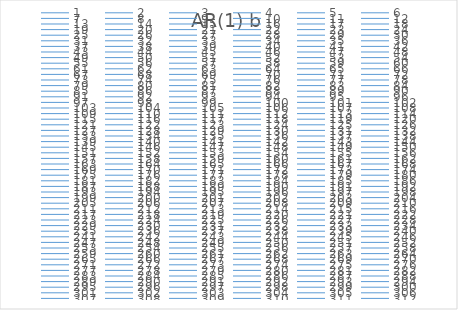
| Category | AR(1) b |
|---|---|
| 0 | 0 |
| 1 | 10.813 |
| 2 | 10.094 |
| 3 | 10.044 |
| 4 | 9.449 |
| 5 | 9.717 |
| 6 | 10.695 |
| 7 | 11.445 |
| 8 | 9.728 |
| 9 | 10.068 |
| 10 | 10.261 |
| 11 | 9.492 |
| 12 | 8.882 |
| 13 | 8.172 |
| 14 | 9.395 |
| 15 | 9.969 |
| 16 | 10.736 |
| 17 | 11.053 |
| 18 | 11.85 |
| 19 | 10.856 |
| 20 | 11.223 |
| 21 | 10.993 |
| 22 | 11.755 |
| 23 | 11.347 |
| 24 | 11.722 |
| 25 | 10.661 |
| 26 | 11.094 |
| 27 | 9.016 |
| 28 | 8.883 |
| 29 | 8.499 |
| 30 | 9.548 |
| 31 | 10.258 |
| 32 | 6.981 |
| 33 | 7.158 |
| 34 | 7.87 |
| 35 | 8.87 |
| 36 | 11.303 |
| 37 | 11.255 |
| 38 | 10.125 |
| 39 | 10.682 |
| 40 | 10.586 |
| 41 | 10.559 |
| 42 | 12.574 |
| 43 | 11.2 |
| 44 | 10.46 |
| 45 | 10.274 |
| 46 | 10.155 |
| 47 | 10.942 |
| 48 | 9.02 |
| 49 | 9.699 |
| 50 | 11.443 |
| 51 | 11.402 |
| 52 | 12.624 |
| 53 | 9.257 |
| 54 | 10.31 |
| 55 | 8.847 |
| 56 | 8.935 |
| 57 | 10.042 |
| 58 | 11.55 |
| 59 | 11.47 |
| 60 | 10.523 |
| 61 | 9.359 |
| 62 | 9.03 |
| 63 | 11.104 |
| 64 | 10.862 |
| 65 | 10.863 |
| 66 | 10.563 |
| 67 | 9.605 |
| 68 | 10.892 |
| 69 | 9.369 |
| 70 | 9.479 |
| 71 | 10.925 |
| 72 | 10.138 |
| 73 | 8.749 |
| 74 | 8.243 |
| 75 | 7.033 |
| 76 | 9.85 |
| 77 | 9.985 |
| 78 | 11.662 |
| 79 | 10.597 |
| 80 | 9.946 |
| 81 | 10.268 |
| 82 | 9.224 |
| 83 | 7.988 |
| 84 | 9.903 |
| 85 | 11.874 |
| 86 | 12.39 |
| 87 | 9.499 |
| 88 | 10.549 |
| 89 | 10.65 |
| 90 | 9.109 |
| 91 | 9.109 |
| 92 | 9.864 |
| 93 | 10.679 |
| 94 | 10.731 |
| 95 | 11.483 |
| 96 | 9.414 |
| 97 | 10.863 |
| 98 | 10.471 |
| 99 | 8.773 |
| 100 | 10.131 |
| 101 | 10.545 |
| 102 | 8.943 |
| 103 | 9.358 |
| 104 | 7.979 |
| 105 | 8.893 |
| 106 | 9.962 |
| 107 | 10.95 |
| 108 | 12.26 |
| 109 | 11.62 |
| 110 | 10.914 |
| 111 | 10.415 |
| 112 | 8.164 |
| 113 | 10.103 |
| 114 | 9.058 |
| 115 | 8.624 |
| 116 | 6.005 |
| 117 | 6.641 |
| 118 | 8.198 |
| 119 | 9.646 |
| 120 | 11.105 |
| 121 | 10.276 |
| 122 | 9.517 |
| 123 | 9.997 |
| 124 | 9.737 |
| 125 | 9.545 |
| 126 | 8.88 |
| 127 | 12.295 |
| 128 | 10.31 |
| 129 | 11.488 |
| 130 | 8.849 |
| 131 | 8.909 |
| 132 | 8.953 |
| 133 | 9.779 |
| 134 | 10.391 |
| 135 | 9.026 |
| 136 | 8.62 |
| 137 | 8.059 |
| 138 | 8.921 |
| 139 | 10.451 |
| 140 | 10.671 |
| 141 | 10.504 |
| 142 | 10.377 |
| 143 | 9.277 |
| 144 | 10.052 |
| 145 | 9.149 |
| 146 | 10.252 |
| 147 | 7.57 |
| 148 | 9.956 |
| 149 | 9.194 |
| 150 | 9.513 |
| 151 | 8.534 |
| 152 | 9.52 |
| 153 | 10.691 |
| 154 | 13.11 |
| 155 | 11.571 |
| 156 | 11.27 |
| 157 | 10.153 |
| 158 | 10.844 |
| 159 | 12.514 |
| 160 | 12.724 |
| 161 | 11.091 |
| 162 | 11.281 |
| 163 | 11.294 |
| 164 | 10.148 |
| 165 | 10.105 |
| 166 | 10.092 |
| 167 | 9.353 |
| 168 | 9.943 |
| 169 | 9.673 |
| 170 | 9.339 |
| 171 | 8.583 |
| 172 | 9.622 |
| 173 | 9.031 |
| 174 | 8.867 |
| 175 | 8.43 |
| 176 | 9.259 |
| 177 | 10.846 |
| 178 | 10.447 |
| 179 | 9.868 |
| 180 | 9.179 |
| 181 | 9.548 |
| 182 | 10.402 |
| 183 | 9.808 |
| 184 | 8.907 |
| 185 | 10.037 |
| 186 | 10.544 |
| 187 | 9.593 |
| 188 | 9.056 |
| 189 | 9.309 |
| 190 | 11.484 |
| 191 | 11.025 |
| 192 | 11.808 |
| 193 | 11.306 |
| 194 | 11.188 |
| 195 | 10.1 |
| 196 | 10.017 |
| 197 | 9.068 |
| 198 | 8.749 |
| 199 | 8.097 |
| 200 | 9.904 |
| 201 | 8.163 |
| 202 | 9.476 |
| 203 | 10.527 |
| 204 | 11.322 |
| 205 | 11.563 |
| 206 | 8.325 |
| 207 | 8.853 |
| 208 | 9.929 |
| 209 | 8.866 |
| 210 | 8.259 |
| 211 | 8.501 |
| 212 | 10.261 |
| 213 | 10.568 |
| 214 | 11.253 |
| 215 | 10.331 |
| 216 | 12.087 |
| 217 | 11.179 |
| 218 | 11.129 |
| 219 | 10.89 |
| 220 | 11.674 |
| 221 | 11.089 |
| 222 | 9.984 |
| 223 | 12.224 |
| 224 | 11.684 |
| 225 | 11.246 |
| 226 | 10.461 |
| 227 | 11.702 |
| 228 | 9.633 |
| 229 | 11.348 |
| 230 | 10.248 |
| 231 | 10.465 |
| 232 | 12.583 |
| 233 | 11.606 |
| 234 | 12.127 |
| 235 | 10.331 |
| 236 | 8.938 |
| 237 | 8.533 |
| 238 | 9.311 |
| 239 | 10.004 |
| 240 | 8.482 |
| 241 | 9.348 |
| 242 | 8.293 |
| 243 | 7.697 |
| 244 | 10.071 |
| 245 | 10.249 |
| 246 | 11.872 |
| 247 | 10.349 |
| 248 | 11.181 |
| 249 | 11.291 |
| 250 | 12.877 |
| 251 | 11.656 |
| 252 | 9.669 |
| 253 | 10.291 |
| 254 | 10.229 |
| 255 | 11.214 |
| 256 | 10.821 |
| 257 | 10.103 |
| 258 | 9.152 |
| 259 | 9.466 |
| 260 | 9.901 |
| 261 | 8.586 |
| 262 | 10.119 |
| 263 | 9.562 |
| 264 | 12.161 |
| 265 | 9.376 |
| 266 | 10.036 |
| 267 | 9.888 |
| 268 | 9.929 |
| 269 | 10.938 |
| 270 | 9.511 |
| 271 | 8.673 |
| 272 | 9.683 |
| 273 | 9.074 |
| 274 | 9.221 |
| 275 | 8.369 |
| 276 | 7.662 |
| 277 | 9.428 |
| 278 | 11.162 |
| 279 | 11.599 |
| 280 | 10.705 |
| 281 | 9.859 |
| 282 | 10.42 |
| 283 | 10.756 |
| 284 | 10.43 |
| 285 | 11.504 |
| 286 | 10.374 |
| 287 | 10.218 |
| 288 | 9.859 |
| 289 | 8.685 |
| 290 | 9.609 |
| 291 | 9.538 |
| 292 | 10.881 |
| 293 | 11.34 |
| 294 | 11.593 |
| 295 | 11.189 |
| 296 | 9.542 |
| 297 | 10.775 |
| 298 | 8.798 |
| 299 | 10.122 |
| 300 | 10.342 |
| 301 | 10.448 |
| 302 | 9.932 |
| 303 | 7.974 |
| 304 | 9.441 |
| 305 | 9.799 |
| 306 | 9.631 |
| 307 | 8.909 |
| 308 | 7.524 |
| 309 | 8.247 |
| 310 | 9.099 |
| 311 | 8.601 |
| 312 | 9.78 |
| 313 | 9.628 |
| 314 | 10.749 |
| 315 | 10.582 |
| 316 | 11.509 |
| 317 | 11.644 |
| 318 | 11.151 |
| 319 | 10.192 |
| 320 | 9.566 |
| 321 | 11.265 |
| 322 | 9.365 |
| 323 | 11.868 |
| 324 | 11.073 |
| 325 | 11.302 |
| 326 | 8.899 |
| 327 | 9.624 |
| 328 | 8.49 |
| 329 | 9.908 |
| 330 | 9.689 |
| 331 | 11.516 |
| 332 | 10.78 |
| 333 | 10.123 |
| 334 | 10.846 |
| 335 | 10.592 |
| 336 | 9.783 |
| 337 | 9.623 |
| 338 | 9.163 |
| 339 | 10.459 |
| 340 | 9.489 |
| 341 | 9.705 |
| 342 | 11.198 |
| 343 | 11.092 |
| 344 | 9.474 |
| 345 | 11.626 |
| 346 | 11.107 |
| 347 | 12.033 |
| 348 | 10.606 |
| 349 | 11.089 |
| 350 | 10.267 |
| 351 | 9.487 |
| 352 | 11.353 |
| 353 | 11.038 |
| 354 | 11.392 |
| 355 | 9.843 |
| 356 | 9.565 |
| 357 | 8.749 |
| 358 | 7.931 |
| 359 | 10.379 |
| 360 | 10.413 |
| 361 | 10.34 |
| 362 | 8.501 |
| 363 | 9.271 |
| 364 | 10.007 |
| 365 | 10.228 |
| 366 | 10.573 |
| 367 | 9.664 |
| 368 | 8.932 |
| 369 | 9.156 |
| 370 | 9.862 |
| 371 | 9.961 |
| 372 | 10.004 |
| 373 | 9.21 |
| 374 | 11.567 |
| 375 | 8.656 |
| 376 | 8.212 |
| 377 | 7.551 |
| 378 | 8.425 |
| 379 | 9.176 |
| 380 | 9.595 |
| 381 | 9.531 |
| 382 | 8.228 |
| 383 | 10.449 |
| 384 | 9.657 |
| 385 | 10.012 |
| 386 | 10.654 |
| 387 | 11.598 |
| 388 | 9.757 |
| 389 | 8.477 |
| 390 | 7.772 |
| 391 | 10.669 |
| 392 | 10.709 |
| 393 | 10.188 |
| 394 | 9.016 |
| 395 | 9.33 |
| 396 | 10.901 |
| 397 | 10.006 |
| 398 | 10.558 |
| 399 | 11.66 |
| 400 | 10 |
| 401 | 10.012 |
| 402 | 10.557 |
| 403 | 9.324 |
| 404 | 10.92 |
| 405 | 9.832 |
| 406 | 9.98 |
| 407 | 8.627 |
| 408 | 11.596 |
| 409 | 10.931 |
| 410 | 10.445 |
| 411 | 10.244 |
| 412 | 9.339 |
| 413 | 11.382 |
| 414 | 10.764 |
| 415 | 11.091 |
| 416 | 11.231 |
| 417 | 9.194 |
| 418 | 10.293 |
| 419 | 8.708 |
| 420 | 9.278 |
| 421 | 10.378 |
| 422 | 10.544 |
| 423 | 11.895 |
| 424 | 11.818 |
| 425 | 12.122 |
| 426 | 12.267 |
| 427 | 11.859 |
| 428 | 9.481 |
| 429 | 8.974 |
| 430 | 8.027 |
| 431 | 9.08 |
| 432 | 10.727 |
| 433 | 9.978 |
| 434 | 9.809 |
| 435 | 12.011 |
| 436 | 12.766 |
| 437 | 11.688 |
| 438 | 10.185 |
| 439 | 11.078 |
| 440 | 11.728 |
| 441 | 13.681 |
| 442 | 12.117 |
| 443 | 9.689 |
| 444 | 9.347 |
| 445 | 7.471 |
| 446 | 8.82 |
| 447 | 9.417 |
| 448 | 11.1 |
| 449 | 12.466 |
| 450 | 9.768 |
| 451 | 10.961 |
| 452 | 10.174 |
| 453 | 11.199 |
| 454 | 10.828 |
| 455 | 9.427 |
| 456 | 9.63 |
| 457 | 9.587 |
| 458 | 9.605 |
| 459 | 9.937 |
| 460 | 10.302 |
| 461 | 9.433 |
| 462 | 8.477 |
| 463 | 7.633 |
| 464 | 10.162 |
| 465 | 10.442 |
| 466 | 11.858 |
| 467 | 10.602 |
| 468 | 11.202 |
| 469 | 10.843 |
| 470 | 10.03 |
| 471 | 8.093 |
| 472 | 10.062 |
| 473 | 10.066 |
| 474 | 12.865 |
| 475 | 11.698 |
| 476 | 11.689 |
| 477 | 9.858 |
| 478 | 8.529 |
| 479 | 9.584 |
| 480 | 11.328 |
| 481 | 11.779 |
| 482 | 12.041 |
| 483 | 11.243 |
| 484 | 9.694 |
| 485 | 9.781 |
| 486 | 8.891 |
| 487 | 9.332 |
| 488 | 8.987 |
| 489 | 8.744 |
| 490 | 8.061 |
| 491 | 9.221 |
| 492 | 9.925 |
| 493 | 10.091 |
| 494 | 10.04 |
| 495 | 10.768 |
| 496 | 9.211 |
| 497 | 9.65 |
| 498 | 11.388 |
| 499 | 11.882 |
| 500 | 11.444 |
| 501 | 9.921 |
| 502 | 9.325 |
| 503 | 9.978 |
| 504 | 10.411 |
| 505 | 10.087 |
| 506 | 9.506 |
| 507 | 9.771 |
| 508 | 10.791 |
| 509 | 10.473 |
| 510 | 11.027 |
| 511 | 10.042 |
| 512 | 8.865 |
| 513 | 9.867 |
| 514 | 8.156 |
| 515 | 7.932 |
| 516 | 10.777 |
| 517 | 11.094 |
| 518 | 11.385 |
| 519 | 9.68 |
| 520 | 10.66 |
| 521 | 10.271 |
| 522 | 8.721 |
| 523 | 7.754 |
| 524 | 7.63 |
| 525 | 8.31 |
| 526 | 7.696 |
| 527 | 9.154 |
| 528 | 8.654 |
| 529 | 9.42 |
| 530 | 8.302 |
| 531 | 9.101 |
| 532 | 8.447 |
| 533 | 9.211 |
| 534 | 9.669 |
| 535 | 9.942 |
| 536 | 10.941 |
| 537 | 10.58 |
| 538 | 9.643 |
| 539 | 9.345 |
| 540 | 11.491 |
| 541 | 11.376 |
| 542 | 11.549 |
| 543 | 11.526 |
| 544 | 11.616 |
| 545 | 11.433 |
| 546 | 12.427 |
| 547 | 11.62 |
| 548 | 10.678 |
| 549 | 8.304 |
| 550 | 8.993 |
| 551 | 8.49 |
| 552 | 8.97 |
| 553 | 6.636 |
| 554 | 5.194 |
| 555 | 8.815 |
| 556 | 9.805 |
| 557 | 11.417 |
| 558 | 11.3 |
| 559 | 8.755 |
| 560 | 10.421 |
| 561 | 10.971 |
| 562 | 11.304 |
| 563 | 11.33 |
| 564 | 11.408 |
| 565 | 12.145 |
| 566 | 10.348 |
| 567 | 11.685 |
| 568 | 10.747 |
| 569 | 8.553 |
| 570 | 8.043 |
| 571 | 7.991 |
| 572 | 9.854 |
| 573 | 10.464 |
| 574 | 9.387 |
| 575 | 10.121 |
| 576 | 8.8 |
| 577 | 9.951 |
| 578 | 9.41 |
| 579 | 9.565 |
| 580 | 8.476 |
| 581 | 8.723 |
| 582 | 9.577 |
| 583 | 9.786 |
| 584 | 9.648 |
| 585 | 7.88 |
| 586 | 10.674 |
| 587 | 9.491 |
| 588 | 10.4 |
| 589 | 8.695 |
| 590 | 9.859 |
| 591 | 8.736 |
| 592 | 9.192 |
| 593 | 9.331 |
| 594 | 9.234 |
| 595 | 11.586 |
| 596 | 10.537 |
| 597 | 9.672 |
| 598 | 9.75 |
| 599 | 10.667 |
| 600 | 11.476 |